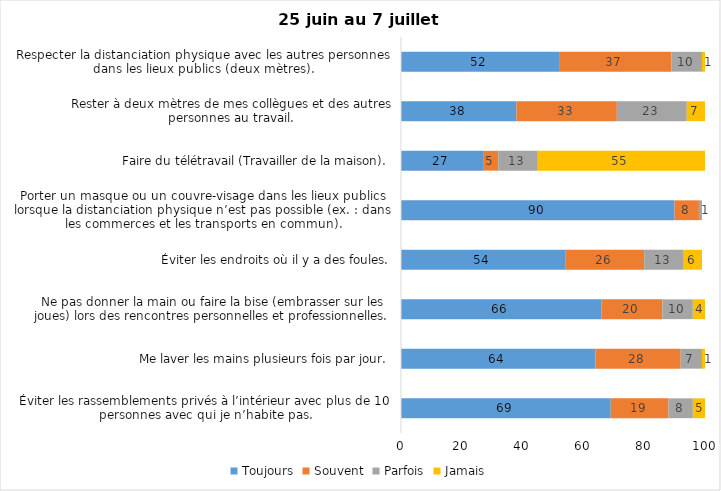
| Category | Toujours | Souvent | Parfois | Jamais |
|---|---|---|---|---|
| Éviter les rassemblements privés à l’intérieur avec plus de 10 personnes avec qui je n’habite pas. | 69 | 19 | 8 | 5 |
| Me laver les mains plusieurs fois par jour. | 64 | 28 | 7 | 1 |
| Ne pas donner la main ou faire la bise (embrasser sur les joues) lors des rencontres personnelles et professionnelles. | 66 | 20 | 10 | 4 |
| Éviter les endroits où il y a des foules. | 54 | 26 | 13 | 6 |
| Porter un masque ou un couvre-visage dans les lieux publics lorsque la distanciation physique n’est pas possible (ex. : dans les commerces et les transports en commun). | 90 | 8 | 1 | 0 |
| Faire du télétravail (Travailler de la maison). | 27 | 5 | 13 | 55 |
| Rester à deux mètres de mes collègues et des autres personnes au travail. | 38 | 33 | 23 | 7 |
| Respecter la distanciation physique avec les autres personnes dans les lieux publics (deux mètres). | 52 | 37 | 10 | 1 |